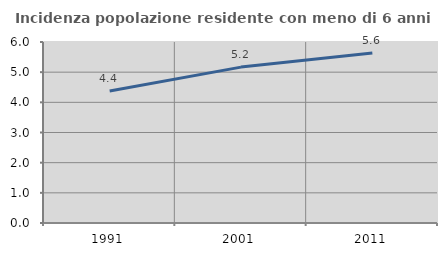
| Category | Incidenza popolazione residente con meno di 6 anni |
|---|---|
| 1991.0 | 4.373 |
| 2001.0 | 5.168 |
| 2011.0 | 5.632 |